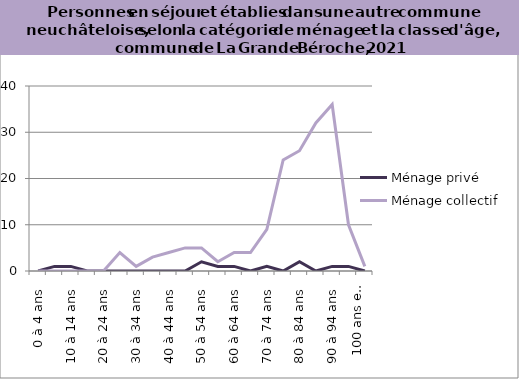
| Category | Ménage privé | Ménage collectif |
|---|---|---|
| 0 à 4 ans | 0 | 0 |
| 5 à 9 ans | 1 | 0 |
| 10 à 14 ans | 1 | 0 |
| 15 à 19 ans | 0 | 0 |
| 20 à 24 ans | 0 | 0 |
| 25 à 29 ans | 0 | 4 |
| 30 à 34 ans | 0 | 1 |
| 35 à 39 ans | 0 | 3 |
| 40 à 44 ans | 0 | 4 |
| 45 à 49 ans | 0 | 5 |
| 50 à 54 ans | 2 | 5 |
| 55 à 59 ans | 1 | 2 |
| 60 à 64 ans | 1 | 4 |
| 65 à 69 ans | 0 | 4 |
| 70 à 74 ans | 1 | 9 |
| 75 à 79 ans | 0 | 24 |
| 80 à 84 ans | 2 | 26 |
| 85 à 89 ans | 0 | 32 |
| 90 à 94 ans | 1 | 36 |
| 95 à 99 ans | 1 | 10 |
| 100 ans et plus | 0 | 1 |